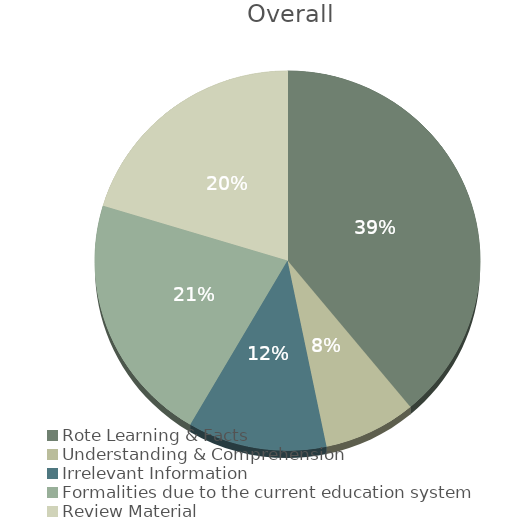
| Category | All Days Averaged |
|---|---|
| Rote Learning & Facts | 16.033 |
| Understanding & Comprehension | 3.192 |
| Irrelevant Information | 4.792 |
| Formalities due to the current education system | 8.738 |
| Review Material | 8.362 |